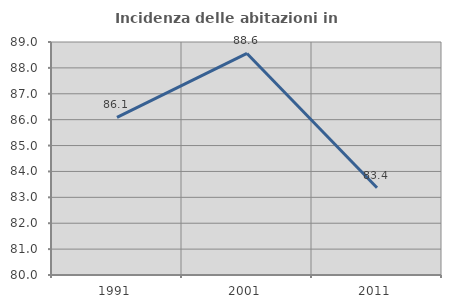
| Category | Incidenza delle abitazioni in proprietà  |
|---|---|
| 1991.0 | 86.085 |
| 2001.0 | 88.558 |
| 2011.0 | 83.371 |